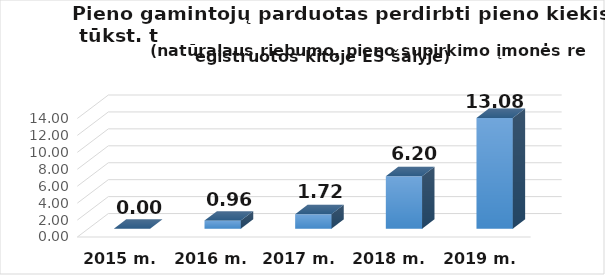
| Category | Kitoje ES šalyje registruotam ūkio subjektui  |
|---|---|
| 2015 m. | 0 |
| 2016 m. | 0.96 |
| 2017 m.  | 1.72 |
| 2018 m.  | 6.2 |
| 2019 m.  | 13.08 |